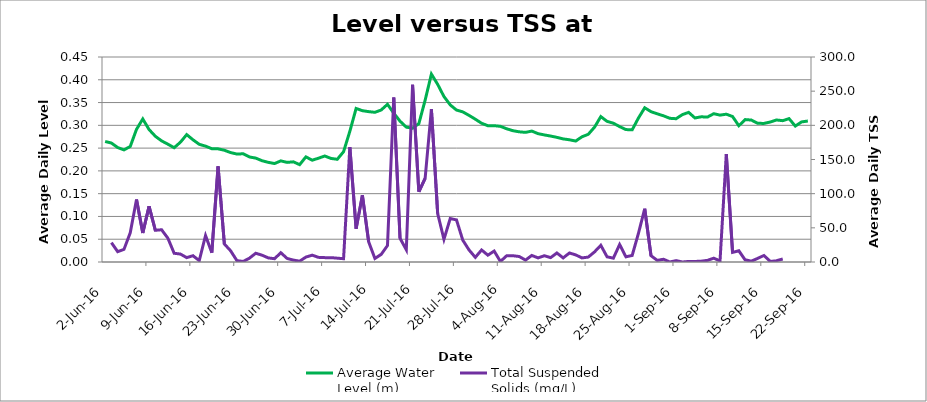
| Category | Average Water 
Level (m) |
|---|---|
| 2016-06-02 | 0.265 |
| 2016-06-03 | 0.261 |
| 2016-06-04 | 0.251 |
| 2016-06-05 | 0.246 |
| 2016-06-06 | 0.254 |
| 2016-06-07 | 0.291 |
| 2016-06-08 | 0.314 |
| 2016-06-09 | 0.291 |
| 2016-06-10 | 0.276 |
| 2016-06-11 | 0.266 |
| 2016-06-12 | 0.259 |
| 2016-06-13 | 0.251 |
| 2016-06-14 | 0.263 |
| 2016-06-15 | 0.28 |
| 2016-06-16 | 0.268 |
| 2016-06-17 | 0.258 |
| 2016-06-18 | 0.254 |
| 2016-06-19 | 0.249 |
| 2016-06-20 | 0.248 |
| 2016-06-21 | 0.245 |
| 2016-06-22 | 0.24 |
| 2016-06-23 | 0.237 |
| 2016-06-24 | 0.238 |
| 2016-06-25 | 0.231 |
| 2016-06-26 | 0.228 |
| 2016-06-27 | 0.222 |
| 2016-06-28 | 0.219 |
| 2016-06-29 | 0.216 |
| 2016-06-30 | 0.222 |
| 2016-07-01 | 0.219 |
| 2016-07-02 | 0.22 |
| 2016-07-03 | 0.214 |
| 2016-07-04 | 0.231 |
| 2016-07-05 | 0.223 |
| 2016-07-06 | 0.228 |
| 2016-07-07 | 0.233 |
| 2016-07-08 | 0.227 |
| 2016-07-09 | 0.225 |
| 2016-07-10 | 0.242 |
| 2016-07-11 | 0.287 |
| 2016-07-12 | 0.337 |
| 2016-07-13 | 0.332 |
| 2016-07-14 | 0.33 |
| 2016-07-15 | 0.329 |
| 2016-07-16 | 0.334 |
| 2016-07-17 | 0.346 |
| 2016-07-18 | 0.327 |
| 2016-07-19 | 0.309 |
| 2016-07-20 | 0.296 |
| 2016-07-21 | 0.294 |
| 2016-07-22 | 0.304 |
| 2016-07-23 | 0.355 |
| 2016-07-24 | 0.412 |
| 2016-07-25 | 0.39 |
| 2016-07-26 | 0.363 |
| 2016-07-27 | 0.345 |
| 2016-07-28 | 0.334 |
| 2016-07-29 | 0.33 |
| 2016-07-30 | 0.322 |
| 2016-07-31 | 0.313 |
| 2016-08-01 | 0.305 |
| 2016-08-02 | 0.299 |
| 2016-08-03 | 0.299 |
| 2016-08-04 | 0.298 |
| 2016-08-05 | 0.292 |
| 2016-08-06 | 0.288 |
| 2016-08-07 | 0.286 |
| 2016-08-08 | 0.285 |
| 2016-08-09 | 0.287 |
| 2016-08-10 | 0.282 |
| 2016-08-11 | 0.279 |
| 2016-08-12 | 0.276 |
| 2016-08-13 | 0.274 |
| 2016-08-14 | 0.27 |
| 2016-08-15 | 0.268 |
| 2016-08-16 | 0.266 |
| 2016-08-17 | 0.275 |
| 2016-08-18 | 0.28 |
| 2016-08-19 | 0.296 |
| 2016-08-20 | 0.319 |
| 2016-08-21 | 0.309 |
| 2016-08-22 | 0.305 |
| 2016-08-23 | 0.297 |
| 2016-08-24 | 0.291 |
| 2016-08-25 | 0.29 |
| 2016-08-26 | 0.316 |
| 2016-08-27 | 0.339 |
| 2016-08-28 | 0.33 |
| 2016-08-29 | 0.325 |
| 2016-08-30 | 0.321 |
| 2016-08-31 | 0.315 |
| 2016-09-01 | 0.315 |
| 2016-09-02 | 0.324 |
| 2016-09-03 | 0.328 |
| 2016-09-04 | 0.316 |
| 2016-09-05 | 0.319 |
| 2016-09-06 | 0.318 |
| 2016-09-07 | 0.326 |
| 2016-09-08 | 0.322 |
| 2016-09-09 | 0.324 |
| 2016-09-10 | 0.319 |
| 2016-09-11 | 0.299 |
| 2016-09-12 | 0.313 |
| 2016-09-13 | 0.312 |
| 2016-09-14 | 0.304 |
| 2016-09-15 | 0.304 |
| 2016-09-16 | 0.307 |
| 2016-09-17 | 0.312 |
| 2016-09-18 | 0.31 |
| 2016-09-19 | 0.315 |
| 2016-09-20 | 0.298 |
| 2016-09-21 | 0.308 |
| 2016-09-22 | 0.309 |